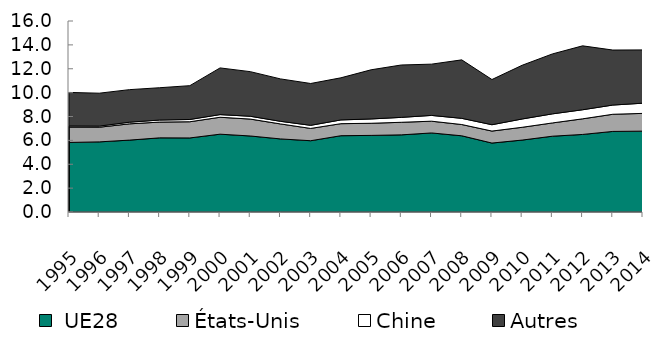
| Category |  UE28 | États-Unis | Chine | Autres |
|---|---|---|---|---|
| 1995.0 | 5.827 | 1.288 | 0.091 | 2.811 |
| 1996.0 | 5.873 | 1.228 | 0.095 | 2.756 |
| 1997.0 | 6.022 | 1.363 | 0.139 | 2.727 |
| 1998.0 | 6.211 | 1.321 | 0.171 | 2.707 |
| 1999.0 | 6.204 | 1.356 | 0.191 | 2.832 |
| 2000.0 | 6.519 | 1.418 | 0.222 | 3.912 |
| 2001.0 | 6.368 | 1.417 | 0.235 | 3.737 |
| 2002.0 | 6.122 | 1.255 | 0.218 | 3.555 |
| 2003.0 | 5.97 | 1.031 | 0.26 | 3.503 |
| 2004.0 | 6.391 | 1.008 | 0.314 | 3.528 |
| 2005.0 | 6.416 | 1.017 | 0.362 | 4.118 |
| 2006.0 | 6.462 | 1.054 | 0.412 | 4.388 |
| 2007.0 | 6.622 | 0.984 | 0.485 | 4.294 |
| 2008.0 | 6.385 | 0.943 | 0.519 | 4.898 |
| 2009.0 | 5.776 | 1.003 | 0.532 | 3.786 |
| 2010.0 | 6.026 | 1.07 | 0.697 | 4.499 |
| 2011.0 | 6.348 | 1.112 | 0.76 | 5.02 |
| 2012.0 | 6.496 | 1.308 | 0.761 | 5.354 |
| 2013.0 | 6.749 | 1.438 | 0.772 | 4.609 |
| 2014.0 | 6.774 | 1.487 | 0.854 | 4.462 |